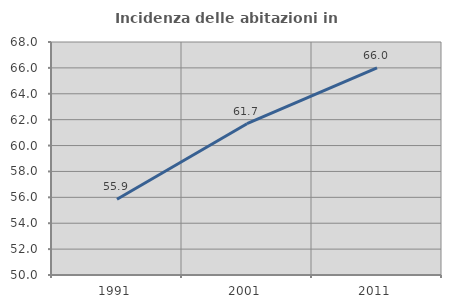
| Category | Incidenza delle abitazioni in proprietà  |
|---|---|
| 1991.0 | 55.851 |
| 2001.0 | 61.69 |
| 2011.0 | 65.993 |